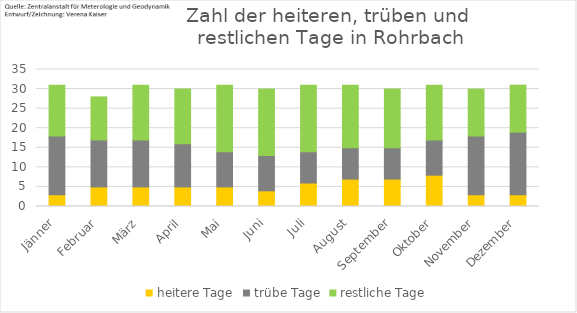
| Category | heitere Tage | trübe Tage | restliche Tage |
|---|---|---|---|
| Jänner | 3 | 15 | 13 |
| Februar | 5 | 12 | 11 |
| März | 5 | 12 | 14 |
| April | 5 | 11 | 14 |
| Mai | 5 | 9 | 17 |
| Juni | 4 | 9 | 17 |
| Juli | 6 | 8 | 17 |
| August | 7 | 8 | 16 |
| September | 7 | 8 | 15 |
| Oktober | 8 | 9 | 14 |
| November | 3 | 15 | 12 |
| Dezember | 3 | 16 | 12 |